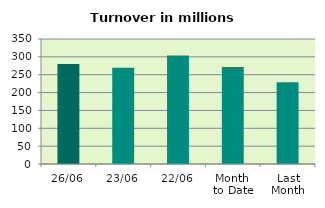
| Category | Series 0 |
|---|---|
| 26/06 | 280.009 |
| 23/06 | 269.214 |
| 22/06 | 303.897 |
| Month 
to Date | 271.325 |
| Last
Month | 228.645 |